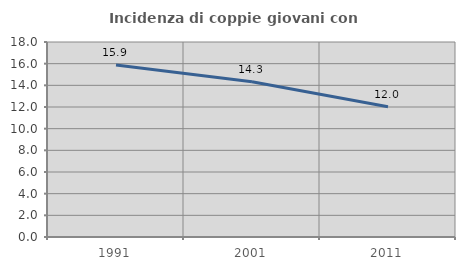
| Category | Incidenza di coppie giovani con figli |
|---|---|
| 1991.0 | 15.88 |
| 2001.0 | 14.34 |
| 2011.0 | 12.023 |